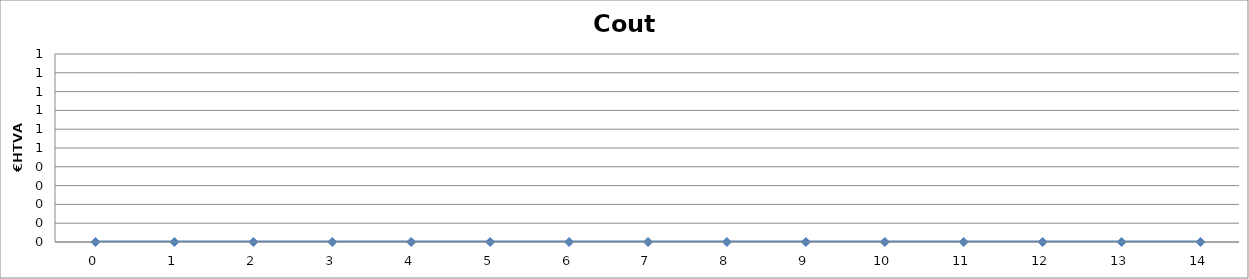
| Category | EAU - €HTVA |
|---|---|
| 0.0 | 0 |
| 1.0 | 0 |
| 2.0 | 0 |
| 3.0 | 0 |
| 4.0 | 0 |
| 5.0 | 0 |
| 6.0 | 0 |
| 7.0 | 0 |
| 8.0 | 0 |
| 9.0 | 0 |
| 10.0 | 0 |
| 11.0 | 0 |
| 12.0 | 0 |
| 13.0 | 0 |
| 14.0 | 0 |